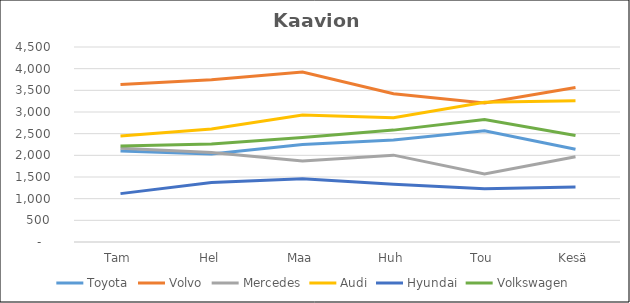
| Category |  Toyota  |  Volvo  |  Mercedes  |  Audi  |  Hyundai  |  Volkswagen  |
|---|---|---|---|---|---|---|
| Tam | 2097.744 | 3636.096 | 2161.544 | 2443.858 | 1116.526 | 2213.064 |
| Hel | 2033.527 | 3743.04 | 2063.292 | 2606.782 | 1370.282 | 2262.243 |
| Maa | 2247.583 | 3921.28 | 1866.788 | 2932.63 | 1459.097 | 2409.781 |
| Huh | 2354.61 | 3422.208 | 2004.341 | 2867.461 | 1332.219 | 2581.908 |
| Tou | 2568.666 | 3208.32 | 1572.032 | 3225.893 | 1230.717 | 2827.804 |
| Kesä | 2140.555 | 3564.8 | 1965.04 | 3258.478 | 1268.78 | 2458.96 |